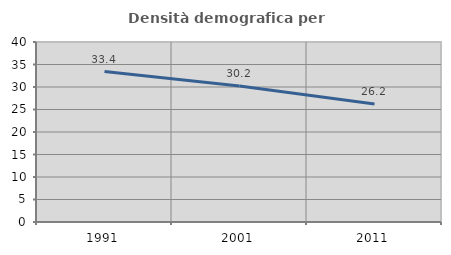
| Category | Densità demografica |
|---|---|
| 1991.0 | 33.43 |
| 2001.0 | 30.211 |
| 2011.0 | 26.246 |